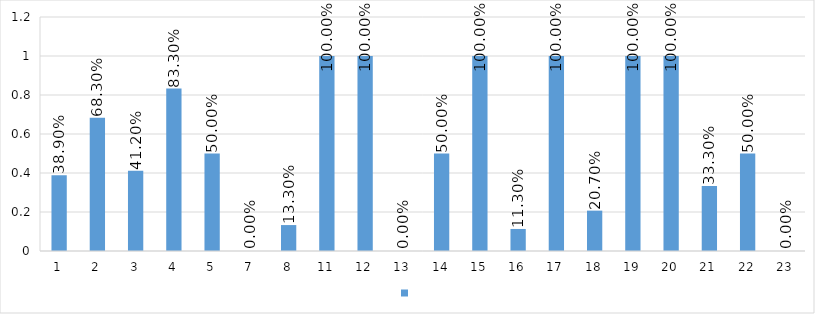
| Category | Series 0 |
|---|---|
| 1 | 0.389 |
| 2 | 0.683 |
| 3 | 0.412 |
| 4 | 0.833 |
| 5 | 0.5 |
| 7 | 0 |
| 8 | 0.133 |
| 11 | 1 |
| 12 | 1 |
| 13 | 0 |
| 14 | 0.5 |
| 15 | 1 |
| 16 | 0.113 |
| 17 | 1 |
| 18 | 0.207 |
| 19 | 1 |
| 20 | 1 |
| 21 | 0.333 |
| 22 | 0.5 |
| 23 | 0 |